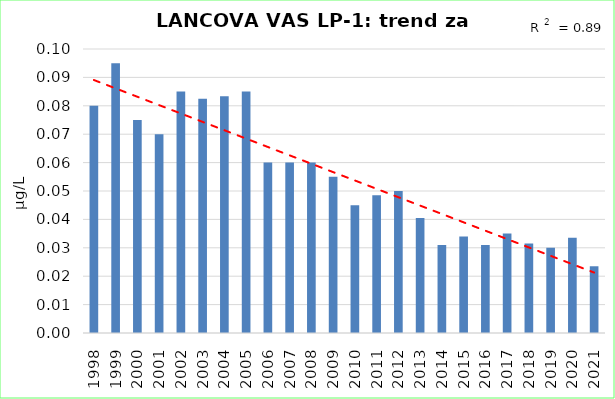
| Category | Vsota |
|---|---|
| 1998 | 0.08 |
| 1999 | 0.095 |
| 2000 | 0.075 |
| 2001 | 0.07 |
| 2002 | 0.085 |
| 2003 | 0.082 |
| 2004 | 0.083 |
| 2005 | 0.085 |
| 2006 | 0.06 |
| 2007 | 0.06 |
| 2008 | 0.06 |
| 2009 | 0.055 |
| 2010 | 0.045 |
| 2011 | 0.048 |
| 2012 | 0.05 |
| 2013 | 0.04 |
| 2014 | 0.031 |
| 2015 | 0.034 |
| 2016 | 0.031 |
| 2017 | 0.035 |
| 2018 | 0.032 |
| 2019 | 0.03 |
| 2020 | 0.034 |
| 2021 | 0.024 |